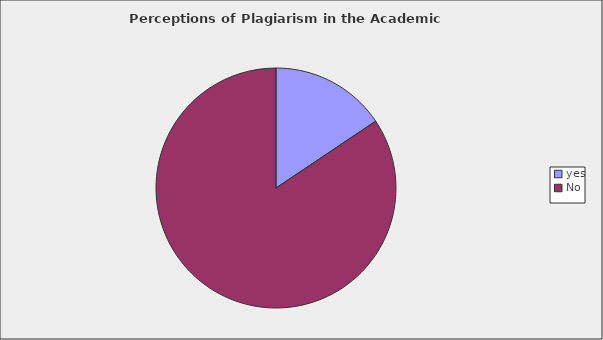
| Category | Series 0 |
|---|---|
| yes | 0.156 |
| No | 0.844 |